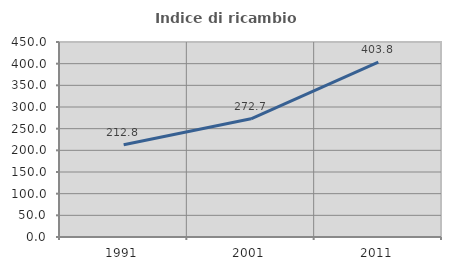
| Category | Indice di ricambio occupazionale  |
|---|---|
| 1991.0 | 212.755 |
| 2001.0 | 272.727 |
| 2011.0 | 403.75 |